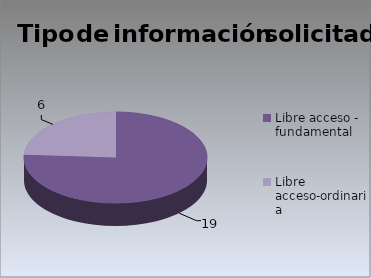
| Category | Series 0 |
|---|---|
| Libre acceso - fundamental | 19 |
| Libre acceso-ordinaria  | 6 |